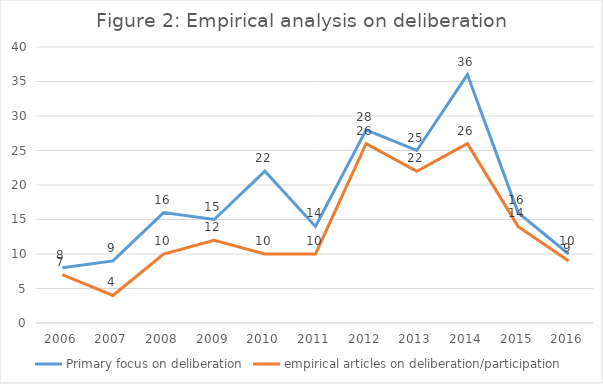
| Category | Primary focus on deliberation | empirical articles on deliberation/participation |
|---|---|---|
| 2006.0 | 8 | 7 |
| 2007.0 | 9 | 4 |
| 2008.0 | 16 | 10 |
| 2009.0 | 15 | 12 |
| 2010.0 | 22 | 10 |
| 2011.0 | 14 | 10 |
| 2012.0 | 28 | 26 |
| 2013.0 | 25 | 22 |
| 2014.0 | 36 | 26 |
| 2015.0 | 16 | 14 |
| 2016.0 | 10 | 9 |